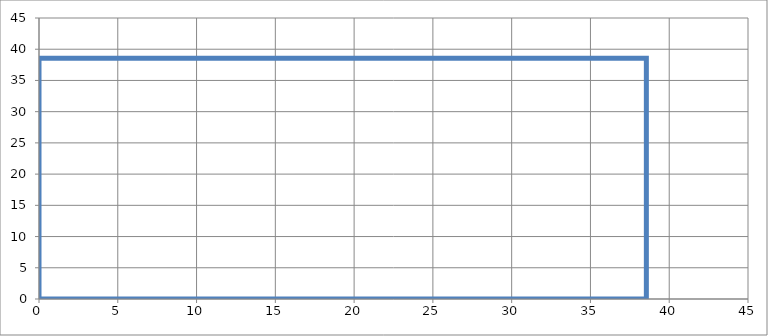
| Category | Series 0 |
|---|---|
| 0.0 | 0 |
| 38.5487 | 0 |
| 38.5487 | 38.549 |
| 0.0 | 38.549 |
| 0.0 | 0 |